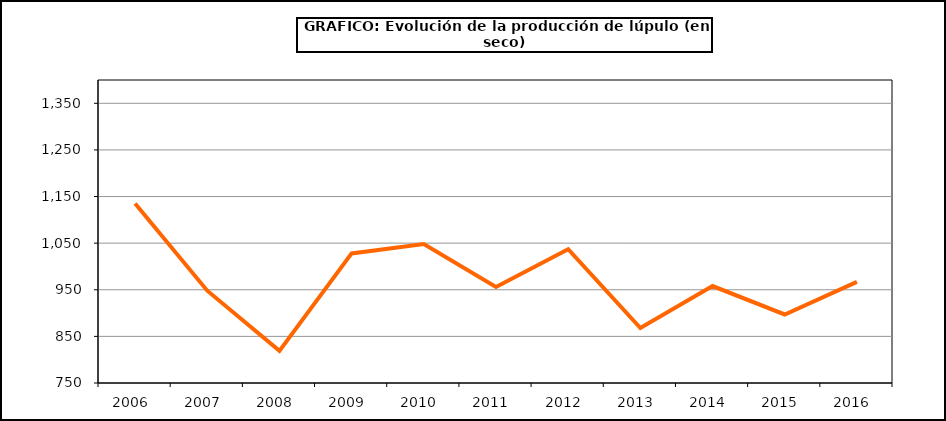
| Category | Superficie |
|---|---|
| 2006.0 | 1135 |
| 2007.0 | 948 |
| 2008.0 | 819 |
| 2009.0 | 1028 |
| 2010.0 | 1048 |
| 2011.0 | 956 |
| 2012.0 | 1037 |
| 2013.0 | 868 |
| 2014.0 | 958 |
| 2015.0 | 897 |
| 2016.0 | 967 |